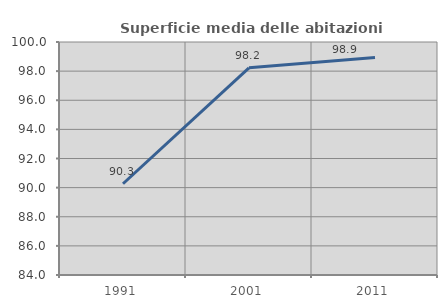
| Category | Superficie media delle abitazioni occupate |
|---|---|
| 1991.0 | 90.267 |
| 2001.0 | 98.227 |
| 2011.0 | 98.935 |